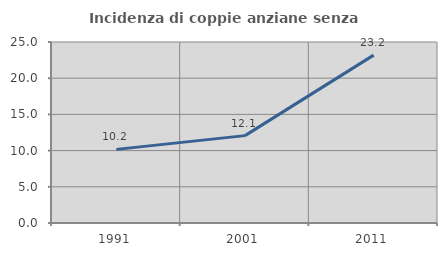
| Category | Incidenza di coppie anziane senza figli  |
|---|---|
| 1991.0 | 10.169 |
| 2001.0 | 12.069 |
| 2011.0 | 23.188 |